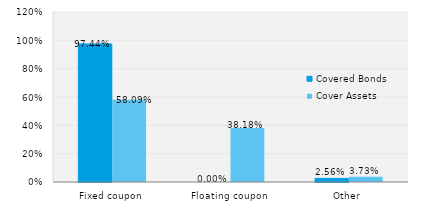
| Category | Covered Bonds | Cover Assets |
|---|---|---|
| Fixed coupon | 0.974 | 0.581 |
| Floating coupon | 0 | 0.382 |
| Other | 0.026 | 0.037 |